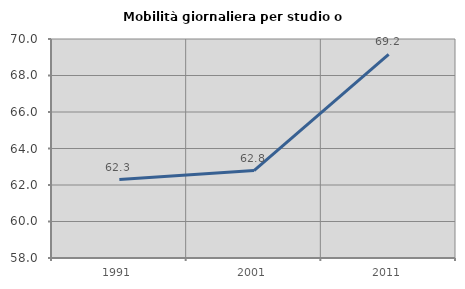
| Category | Mobilità giornaliera per studio o lavoro |
|---|---|
| 1991.0 | 62.295 |
| 2001.0 | 62.794 |
| 2011.0 | 69.163 |